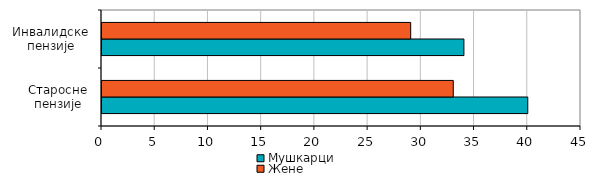
| Category | Мушкарци | Жене |
|---|---|---|
| Старосне
пензије | 40 | 33 |
| Инвалидске
пензије | 34 | 29 |